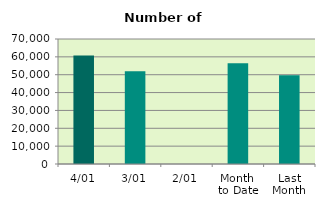
| Category | Series 0 |
|---|---|
| 4/01 | 60696 |
| 3/01 | 52008 |
| 2/01 | 0 |
| Month 
to Date | 56352 |
| Last
Month | 49764 |